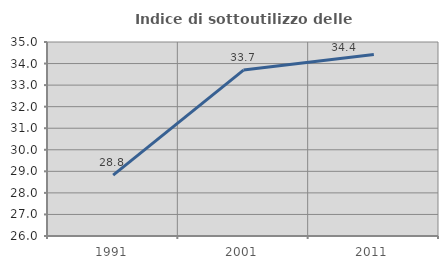
| Category | Indice di sottoutilizzo delle abitazioni  |
|---|---|
| 1991.0 | 28.824 |
| 2001.0 | 33.698 |
| 2011.0 | 34.415 |